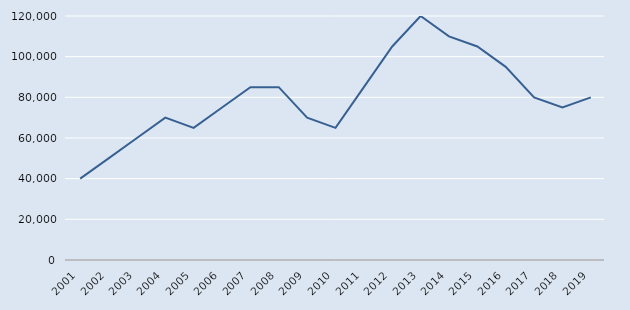
| Category | Series 1 |
|---|---|
| 2001.0 | 40000 |
| 2002.0 | 50000 |
| 2003.0 | 60000 |
| 2004.0 | 70000 |
| 2005.0 | 65000 |
| 2006.0 | 75000 |
| 2007.0 | 85000 |
| 2008.0 | 85000 |
| 2009.0 | 70000 |
| 2010.0 | 65000 |
| 2011.0 | 85000 |
| 2012.0 | 105000 |
| 2013.0 | 120000 |
| 2014.0 | 110000 |
| 2015.0 | 105000 |
| 2016.0 | 95000 |
| 2017.0 | 80000 |
| 2018.0 | 75000 |
| 2019.0 | 80000 |